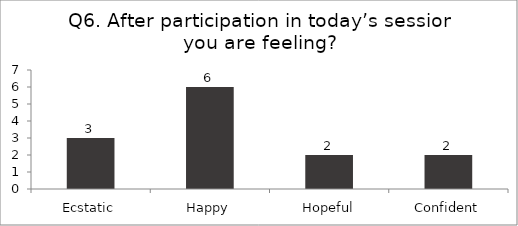
| Category | Q6. After participation in today’s session you are feeling? |
|---|---|
| Ecstatic | 3 |
| Happy | 6 |
| Hopeful | 2 |
| Confident | 2 |